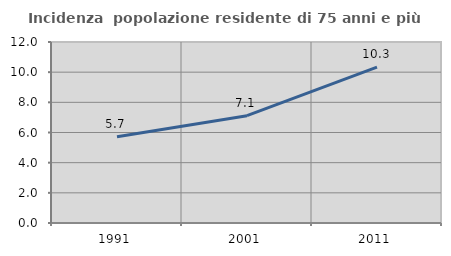
| Category | Incidenza  popolazione residente di 75 anni e più |
|---|---|
| 1991.0 | 5.723 |
| 2001.0 | 7.115 |
| 2011.0 | 10.328 |